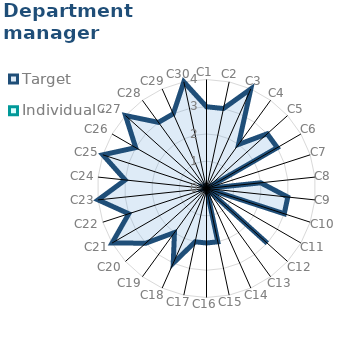
| Category | Target | Individual 4 |
|---|---|---|
| C1 | 3 | 0 |
| C2 | 3 | 0 |
| C3 | 4 | 0 |
| C4 | 2 | 0 |
| C5 | 3 | 0 |
| C6 | 3 | 0 |
| C7 | 0 | 0 |
| C8 | 2 | 0 |
| C9 | 3 | 0 |
| C10 | 3 | 0 |
| C11 | 0 | 0 |
| C12 | 3 | 0 |
| C13 | 0 | 0 |
| C14 | 0 | 0 |
| C15 | 2 | 0 |
| C16 | 2 | 0 |
| C17 | 2 | 0 |
| C18 | 3 | 0 |
| C19 | 2 | 0 |
| C20 | 3 | 0 |
| C21 | 4 | 0 |
| C22 | 3 | 0 |
| C23 | 4 | 0 |
| C24 | 3 | 0 |
| C25 | 4 | 0 |
| C26 | 3 | 0 |
| C27 | 4 | 0 |
| C28 | 3 | 0 |
| C29 | 3 | 0 |
| C30 | 4 | 0 |